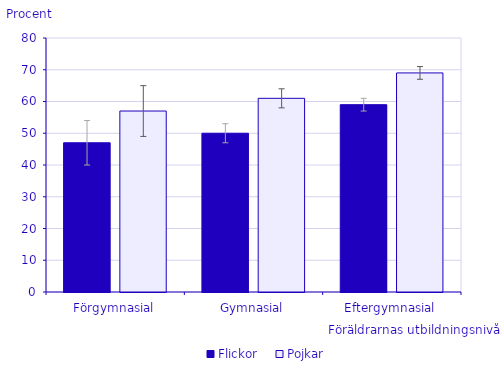
| Category | Flickor | Pojkar |
|---|---|---|
| Förgymnasial | 47 | 57 |
| Gymnasial | 50 | 61 |
| Eftergymnasial | 59 | 69 |